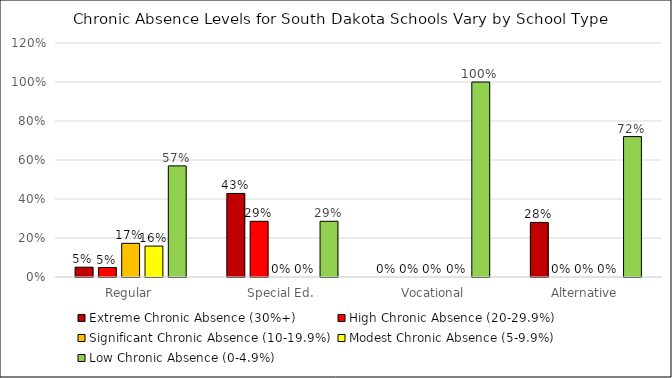
| Category | Extreme Chronic Absence (30%+) | High Chronic Absence (20-29.9%) | Significant Chronic Absence (10-19.9%) | Modest Chronic Absence (5-9.9%) | Low Chronic Absence (0-4.9%) |
|---|---|---|---|---|---|
| Regular | 0.05 | 0.049 | 0.173 | 0.159 | 0.57 |
| Special Ed. | 0.429 | 0.286 | 0 | 0 | 0.286 |
| Vocational | 0 | 0 | 0 | 0 | 1 |
| Alternative | 0.28 | 0 | 0 | 0 | 0.72 |